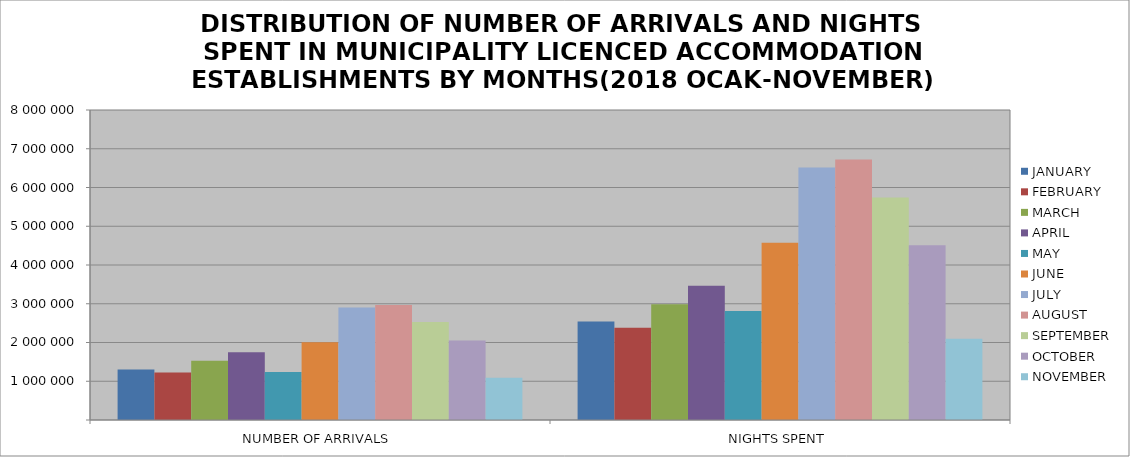
| Category | JANUARY | FEBRUARY | MARCH | APRIL | MAY | JUNE | JULY | AUGUST | SEPTEMBER | OCTOBER | NOVEMBER |
|---|---|---|---|---|---|---|---|---|---|---|---|
| NUMBER OF ARRIVALS | 1303353 | 1223475 | 1526172 | 1749085 | 1240889 | 2003881 | 2904028 | 2966995 | 2525986 | 2049336 | 1090355 |
| NIGHTS SPENT | 2542103 | 2381300 | 2986820 | 3463261 | 2810808 | 4572629 | 6517690 | 6721558 | 5740112 | 4508357 | 2094304 |